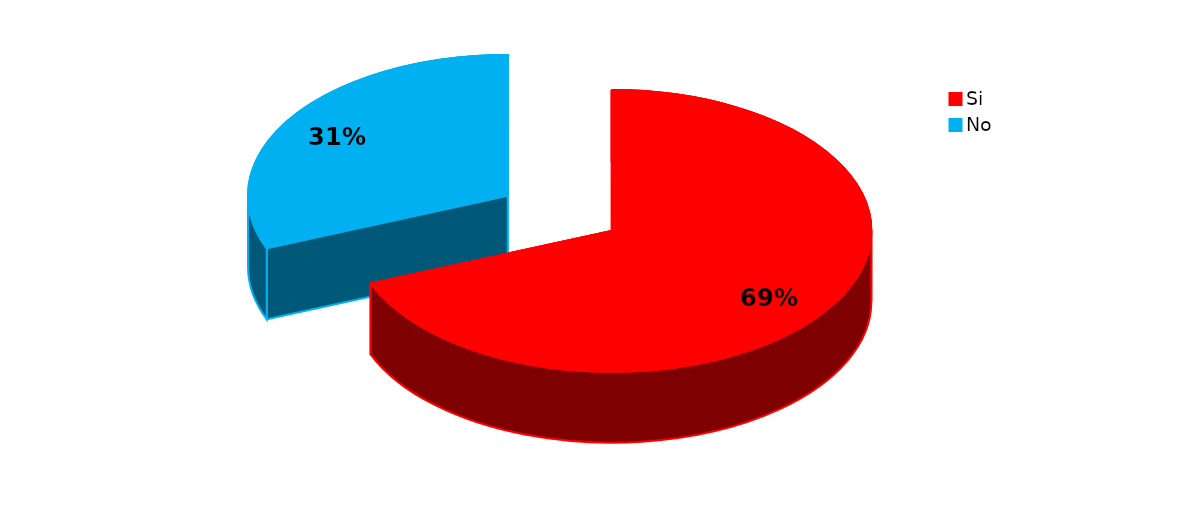
| Category | Series 0 |
|---|---|
| Si | 51 |
| No | 23 |